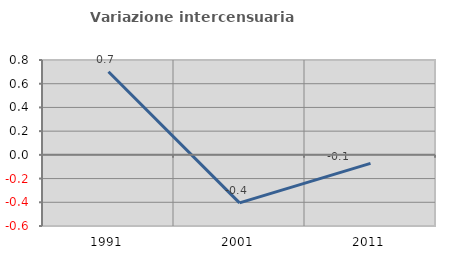
| Category | Variazione intercensuaria annua |
|---|---|
| 1991.0 | 0.701 |
| 2001.0 | -0.405 |
| 2011.0 | -0.072 |